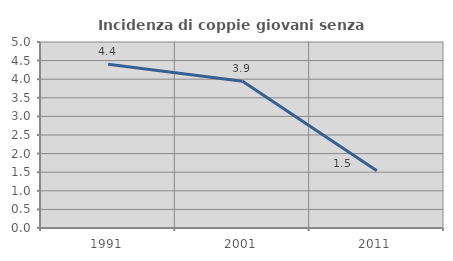
| Category | Incidenza di coppie giovani senza figli |
|---|---|
| 1991.0 | 4.403 |
| 2001.0 | 3.947 |
| 2011.0 | 1.538 |